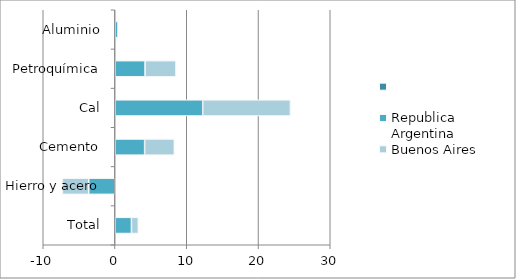
| Category | Series 0 | Republica Argentina | Buenos Aires |
|---|---|---|---|
| Total |  | 2.293 | 0.959 |
| Hierro y acero |  | -3.664 | -3.665 |
| Cemento |  | 4.132 | 4.135 |
| Cal |  | 12.227 | 12.224 |
| Petroquímica |  | 4.191 | 4.309 |
| Aluminio |  | 0.422 | 0 |